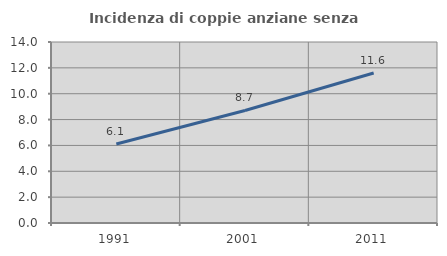
| Category | Incidenza di coppie anziane senza figli  |
|---|---|
| 1991.0 | 6.113 |
| 2001.0 | 8.705 |
| 2011.0 | 11.602 |